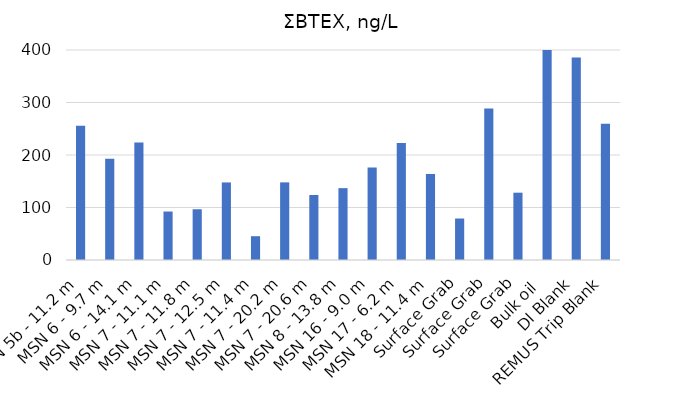
| Category | ΣBTEX |
|---|---|
| MSN 5b - 11.2 m | 255.91 |
| MSN 6 - 9.7 m | 192.8 |
| MSN 6 - 14.1 m | 223.89 |
| MSN 7 - 11.1 m | 92.36 |
| MSN 7 - 11.8 m | 96.65 |
| MSN 7 - 12.5 m | 147.74 |
| MSN 7 - 11.4 m | 45.33 |
| MSN 7 - 20.2 m | 147.86 |
| MSN 7 - 20.6 m | 123.76 |
| MSN 8 - 13.8 m | 136.85 |
| MSN 16 - 9.0 m | 176.36 |
| MSN 17 - 6.2 m | 222.97 |
| MSN 18 - 11.4 m | 163.93 |
| Surface Grab | 79.01 |
| Surface Grab | 288.5 |
| Surface Grab | 128.21 |
| Bulk oil  | 650.92 |
| DI Blank | 385.53 |
| REMUS Trip Blank | 259.31 |